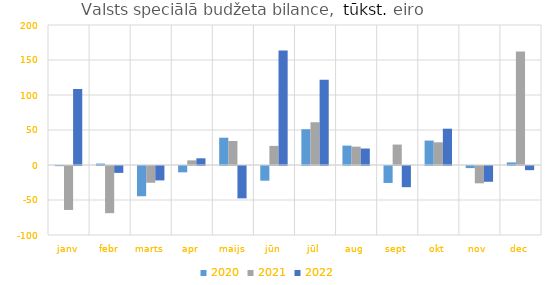
| Category | 2020 | 2021 | 2022 |
|---|---|---|---|
| janv | -199.839 | -62808.075 | 108554.179 |
| febr | 2049.427 | -67375.438 | -9818.538 |
| marts | -43219.176 | -23930.666 | -20590.078 |
| apr | -9074.401 | 6610.878 | 9551.101 |
| maijs | 38978.317 | 34323.187 | -46228.723 |
| jūn | -20988.328 | 27288.039 | 163534.283 |
| jūl | 51118.587 | 61101.998 | 121861.127 |
| aug | 27698.363 | 26197.43 | 23515.069 |
| sept | -24231.793 | 29202.435 | -30249.526 |
| okt | 34894.946 | 32397.037 | 51869.404 |
| nov | -3008.189 | -24738.863 | -22523.369 |
| dec | 3652.649 | 162256.524 | -5948.69 |